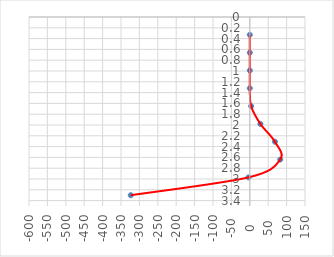
| Category | o |
|---|---|
| 0.0 | 0.33 |
| 0.0 | 0.66 |
| 0.0 | 0.99 |
| 0.0 | 1.32 |
| 3.5937 | 1.65 |
| 28.7496 | 1.98 |
| 68.2803 | 2.31 |
| 82.65509999999999 | 2.64 |
| -3.5937 | 2.97 |
| -323.433 | 3.3 |